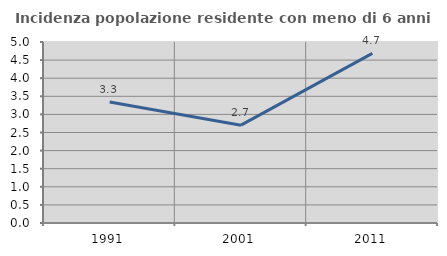
| Category | Incidenza popolazione residente con meno di 6 anni |
|---|---|
| 1991.0 | 3.344 |
| 2001.0 | 2.703 |
| 2011.0 | 4.688 |